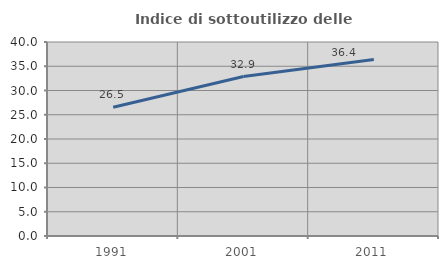
| Category | Indice di sottoutilizzo delle abitazioni  |
|---|---|
| 1991.0 | 26.531 |
| 2001.0 | 32.883 |
| 2011.0 | 36.398 |